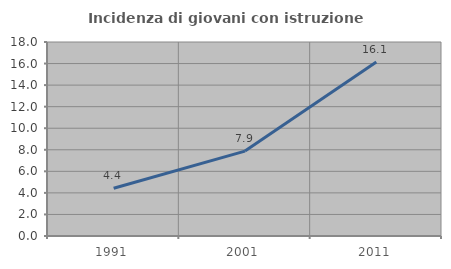
| Category | Incidenza di giovani con istruzione universitaria |
|---|---|
| 1991.0 | 4.425 |
| 2001.0 | 7.879 |
| 2011.0 | 16.149 |